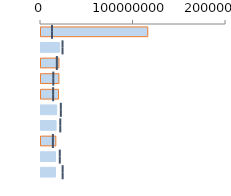
| Category | Rouge | Normal |
|---|---|---|
|  | 116505700 | 0 |
|  | 0 | 21247600 |